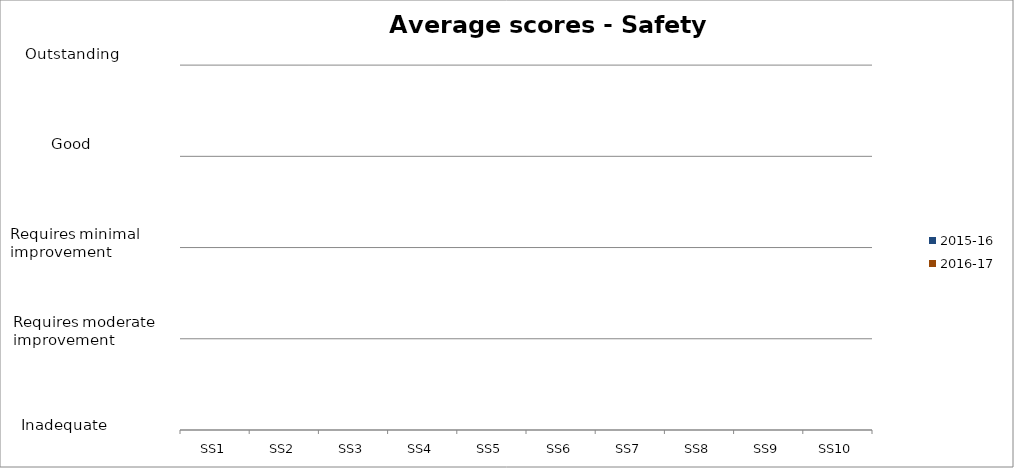
| Category | 2015-16 | 2016-17 |
|---|---|---|
| SS1 | 0 | 0 |
| SS2 | 0 | 0 |
| SS3 | 0 | 0 |
| SS4 | 0 | 0 |
| SS5 | 0 | 0 |
| SS6 | 0 | 0 |
| SS7 | 0 | 0 |
| SS8 | 0 | 0 |
| SS9 | 0 | 0 |
| SS10 | 0 | 0 |